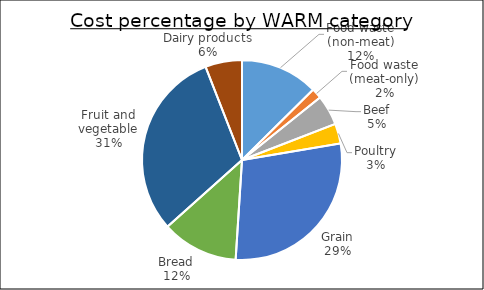
| Category | Series 0 |
|---|---|
| Food waste (non-meat) | 1.678 |
| Food waste (meat-only) | 0.223 |
| Beef | 0.651 |
| Poultry | 0.429 |
| Grain | 3.826 |
| Bread | 1.651 |
| Fruit and vegetable | 4.094 |
| Dairy products | 0.792 |